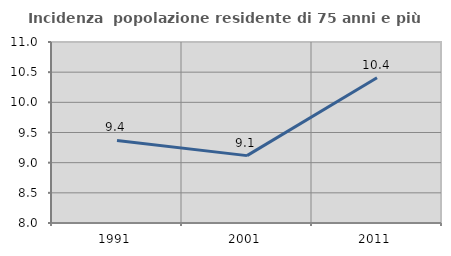
| Category | Incidenza  popolazione residente di 75 anni e più |
|---|---|
| 1991.0 | 9.368 |
| 2001.0 | 9.117 |
| 2011.0 | 10.407 |